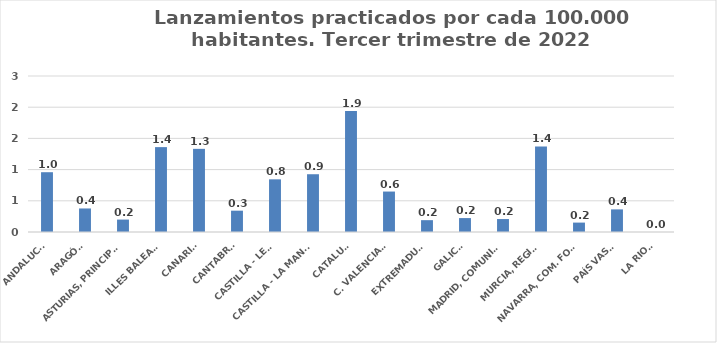
| Category | Series 0 |
|---|---|
| ANDALUCÍA | 0.958 |
| ARAGÓN | 0.377 |
| ASTURIAS, PRINCIPADO | 0.199 |
| ILLES BALEARS | 1.36 |
| CANARIAS | 1.332 |
| CANTABRIA | 0.342 |
| CASTILLA - LEÓN | 0.844 |
| CASTILLA - LA MANCHA | 0.926 |
| CATALUÑA | 1.94 |
| C. VALENCIANA | 0.648 |
| EXTREMADURA | 0.19 |
| GALICIA | 0.223 |
| MADRID, COMUNIDAD | 0.208 |
| MURCIA, REGIÓN | 1.371 |
| NAVARRA, COM. FORAL | 0.151 |
| PAÍS VASCO | 0.362 |
| LA RIOJA | 0 |